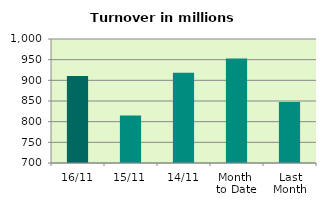
| Category | Series 0 |
|---|---|
| 16/11 | 910.393 |
| 15/11 | 814.655 |
| 14/11 | 918.522 |
| Month 
to Date | 952.952 |
| Last
Month | 847.422 |